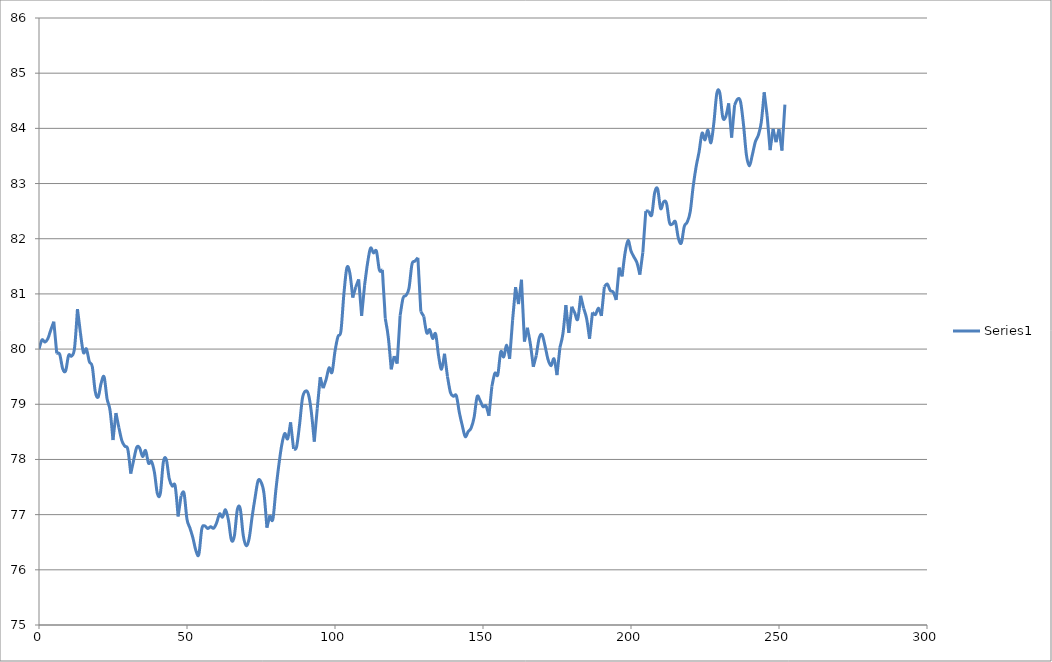
| Category | Series 0 |
|---|---|
| 0.0 | 80 |
| 1.0 | 80.166 |
| 2.0 | 80.127 |
| 3.0 | 80.19 |
| 4.0 | 80.349 |
| 5.0 | 80.496 |
| 6.0 | 79.923 |
| 7.0 | 79.904 |
| 8.0 | 79.645 |
| 9.0 | 79.606 |
| 10.0 | 79.886 |
| 11.0 | 79.873 |
| 12.0 | 80.017 |
| 13.0 | 80.726 |
| 14.0 | 80.291 |
| 15.0 | 79.939 |
| 16.0 | 80.004 |
| 17.0 | 79.773 |
| 18.0 | 79.683 |
| 19.0 | 79.231 |
| 20.0 | 79.132 |
| 21.0 | 79.383 |
| 22.0 | 79.495 |
| 23.0 | 79.098 |
| 24.0 | 78.89 |
| 25.0 | 78.352 |
| 26.0 | 78.841 |
| 27.0 | 78.573 |
| 28.0 | 78.34 |
| 29.0 | 78.239 |
| 30.0 | 78.184 |
| 31.0 | 77.743 |
| 32.0 | 77.991 |
| 33.0 | 78.218 |
| 34.0 | 78.209 |
| 35.0 | 78.054 |
| 36.0 | 78.162 |
| 37.0 | 77.932 |
| 38.0 | 77.962 |
| 39.0 | 77.765 |
| 40.0 | 77.378 |
| 41.0 | 77.388 |
| 42.0 | 77.949 |
| 43.0 | 78.001 |
| 44.0 | 77.653 |
| 45.0 | 77.519 |
| 46.0 | 77.521 |
| 47.0 | 76.967 |
| 48.0 | 77.343 |
| 49.0 | 77.388 |
| 50.0 | 76.915 |
| 51.0 | 76.756 |
| 52.0 | 76.578 |
| 53.0 | 76.351 |
| 54.0 | 76.279 |
| 55.0 | 76.741 |
| 56.0 | 76.796 |
| 57.0 | 76.749 |
| 58.0 | 76.781 |
| 59.0 | 76.753 |
| 60.0 | 76.849 |
| 61.0 | 77.013 |
| 62.0 | 76.956 |
| 63.0 | 77.088 |
| 64.0 | 76.899 |
| 65.0 | 76.541 |
| 66.0 | 76.612 |
| 67.0 | 77.089 |
| 68.0 | 77.104 |
| 69.0 | 76.626 |
| 70.0 | 76.438 |
| 71.0 | 76.569 |
| 72.0 | 76.961 |
| 73.0 | 77.308 |
| 74.0 | 77.613 |
| 75.0 | 77.591 |
| 76.0 | 77.387 |
| 77.0 | 76.764 |
| 78.0 | 76.988 |
| 79.0 | 76.913 |
| 80.0 | 77.435 |
| 81.0 | 77.888 |
| 82.0 | 78.26 |
| 83.0 | 78.469 |
| 84.0 | 78.375 |
| 85.0 | 78.673 |
| 86.0 | 78.193 |
| 87.0 | 78.224 |
| 88.0 | 78.618 |
| 89.0 | 79.109 |
| 90.0 | 79.237 |
| 91.0 | 79.185 |
| 92.0 | 78.863 |
| 93.0 | 78.323 |
| 94.0 | 78.918 |
| 95.0 | 79.49 |
| 96.0 | 79.291 |
| 97.0 | 79.449 |
| 98.0 | 79.66 |
| 99.0 | 79.579 |
| 100.0 | 79.961 |
| 101.0 | 80.227 |
| 102.0 | 80.325 |
| 103.0 | 80.995 |
| 104.0 | 81.472 |
| 105.0 | 81.381 |
| 106.0 | 80.933 |
| 107.0 | 81.123 |
| 108.0 | 81.263 |
| 109.0 | 80.604 |
| 110.0 | 81.16 |
| 111.0 | 81.559 |
| 112.0 | 81.829 |
| 113.0 | 81.743 |
| 114.0 | 81.773 |
| 115.0 | 81.431 |
| 116.0 | 81.437 |
| 117.0 | 80.55 |
| 118.0 | 80.216 |
| 119.0 | 79.633 |
| 120.0 | 79.873 |
| 121.0 | 79.737 |
| 122.0 | 80.606 |
| 123.0 | 80.926 |
| 124.0 | 80.975 |
| 125.0 | 81.104 |
| 126.0 | 81.536 |
| 127.0 | 81.594 |
| 128.0 | 81.655 |
| 129.0 | 80.678 |
| 130.0 | 80.594 |
| 131.0 | 80.294 |
| 132.0 | 80.353 |
| 133.0 | 80.194 |
| 134.0 | 80.274 |
| 135.0 | 79.878 |
| 136.0 | 79.634 |
| 137.0 | 79.916 |
| 138.0 | 79.5 |
| 139.0 | 79.214 |
| 140.0 | 79.146 |
| 141.0 | 79.155 |
| 142.0 | 78.853 |
| 143.0 | 78.614 |
| 144.0 | 78.414 |
| 145.0 | 78.505 |
| 146.0 | 78.571 |
| 147.0 | 78.764 |
| 148.0 | 79.136 |
| 149.0 | 79.07 |
| 150.0 | 78.957 |
| 151.0 | 78.97 |
| 152.0 | 78.792 |
| 153.0 | 79.326 |
| 154.0 | 79.561 |
| 155.0 | 79.536 |
| 156.0 | 79.95 |
| 157.0 | 79.858 |
| 158.0 | 80.07 |
| 159.0 | 79.823 |
| 160.0 | 80.527 |
| 161.0 | 81.123 |
| 162.0 | 80.815 |
| 163.0 | 81.257 |
| 164.0 | 80.136 |
| 165.0 | 80.387 |
| 166.0 | 80.091 |
| 167.0 | 79.679 |
| 168.0 | 79.885 |
| 169.0 | 80.203 |
| 170.0 | 80.257 |
| 171.0 | 80.047 |
| 172.0 | 79.805 |
| 173.0 | 79.699 |
| 174.0 | 79.823 |
| 175.0 | 79.528 |
| 176.0 | 80.034 |
| 177.0 | 80.278 |
| 178.0 | 80.798 |
| 179.0 | 80.293 |
| 180.0 | 80.768 |
| 181.0 | 80.655 |
| 182.0 | 80.541 |
| 183.0 | 80.967 |
| 184.0 | 80.738 |
| 185.0 | 80.555 |
| 186.0 | 80.187 |
| 187.0 | 80.664 |
| 188.0 | 80.626 |
| 189.0 | 80.742 |
| 190.0 | 80.602 |
| 191.0 | 81.13 |
| 192.0 | 81.179 |
| 193.0 | 81.061 |
| 194.0 | 81.033 |
| 195.0 | 80.89 |
| 196.0 | 81.478 |
| 197.0 | 81.317 |
| 198.0 | 81.744 |
| 199.0 | 81.971 |
| 200.0 | 81.779 |
| 201.0 | 81.669 |
| 202.0 | 81.566 |
| 203.0 | 81.349 |
| 204.0 | 81.753 |
| 205.0 | 82.502 |
| 206.0 | 82.5 |
| 207.0 | 82.431 |
| 208.0 | 82.834 |
| 209.0 | 82.901 |
| 210.0 | 82.548 |
| 211.0 | 82.668 |
| 212.0 | 82.642 |
| 213.0 | 82.291 |
| 214.0 | 82.266 |
| 215.0 | 82.306 |
| 216.0 | 82.011 |
| 217.0 | 81.923 |
| 218.0 | 82.223 |
| 219.0 | 82.302 |
| 220.0 | 82.488 |
| 221.0 | 82.946 |
| 222.0 | 83.305 |
| 223.0 | 83.575 |
| 224.0 | 83.912 |
| 225.0 | 83.792 |
| 226.0 | 83.969 |
| 227.0 | 83.739 |
| 228.0 | 84.104 |
| 229.0 | 84.636 |
| 230.0 | 84.643 |
| 231.0 | 84.201 |
| 232.0 | 84.212 |
| 233.0 | 84.454 |
| 234.0 | 83.832 |
| 235.0 | 84.421 |
| 236.0 | 84.53 |
| 237.0 | 84.484 |
| 238.0 | 84.07 |
| 239.0 | 83.515 |
| 240.0 | 83.32 |
| 241.0 | 83.522 |
| 242.0 | 83.755 |
| 243.0 | 83.875 |
| 244.0 | 84.108 |
| 245.0 | 84.654 |
| 246.0 | 84.225 |
| 247.0 | 83.605 |
| 248.0 | 83.991 |
| 249.0 | 83.749 |
| 250.0 | 83.985 |
| 251.0 | 83.598 |
| 252.0 | 84.431 |